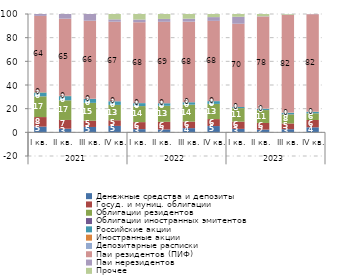
| Category | Денежные средства и депозиты | Госуд. и муниц. облигации | Облигации резидентов | Облигации иностранных эмитентов | Российские акции | Иностранные акции | Депозитарные расписки | Паи резидентов (ПИФ) | Паи нерезидентов | Прочее |
|---|---|---|---|---|---|---|---|---|---|---|
| 0 | 4.843 | 8.058 | 17.483 | 0.088 | 3.2 | 0.31 | 0.032 | 64.384 | 1.592 | 0.009 |
| 1 | 3.061 | 7.393 | 16.591 | 0.094 | 3.461 | 0.336 | 0.031 | 65.074 | 3.949 | 0.01 |
| 2 | 4.539 | 5.279 | 15.019 | 0.082 | 3.412 | 0.02 | 0.003 | 65.964 | 5.666 | 0.016 |
| 3 | 5.422 | 4.797 | 12.887 | 0.073 | 3.061 | 0.016 | 0.003 | 67.214 | 2.025 | 4.502 |
| 4 | 2.72 | 5.911 | 13.531 | 0.069 | 2.428 | 0.039 | 0.025 | 68.365 | 2.267 | 4.647 |
| 5 | 2.43 | 6.45 | 13.483 | 0.072 | 2.165 | 0.025 | 0.017 | 68.767 | 2.433 | 4.157 |
| 6 | 3.542 | 5.518 | 14.273 | 0.074 | 2.011 | 0.027 | 0.023 | 68.046 | 2.521 | 3.966 |
| 7 | 5.31 | 5.868 | 12.785 | 0.065 | 2.316 | 0.029 | 0.022 | 67.817 | 3.174 | 2.615 |
| 8 | 2.919 | 6.127 | 11.412 | 0.056 | 0.907 | 0.023 | 0.008 | 70.316 | 5.912 | 2.321 |
| 9 | 2.301 | 5.614 | 10.885 | 0.089 | 1.025 | 0.168 | 0.043 | 77.754 | 0.235 | 1.885 |
| 10 | 2.638 | 4.861 | 7.646 | 0.203 | 1.128 | 0.206 | 0.041 | 82.461 | 0.279 | 0.536 |
| 11 | 4.249 | 6.196 | 5.587 | 0.095 | 1.2 | 0.272 | 0.061 | 82.171 | 0.311 | -0.143 |